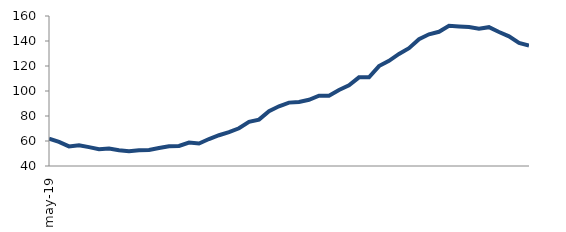
| Category | Series 0 |
|---|---|
| 2019-05-01 | 61.943 |
| 2019-06-01 | 59.307 |
| 2019-07-01 | 55.7 |
| 2019-08-01 | 56.658 |
| 2019-09-01 | 55.107 |
| 2019-10-01 | 53.41 |
| 2019-11-01 | 53.924 |
| 2019-12-01 | 52.607 |
| 2020-01-01 | 51.869 |
| 2020-02-01 | 52.619 |
| 2020-03-01 | 52.83 |
| 2020-04-01 | 54.43 |
| 2020-05-01 | 55.851 |
| 2020-06-01 | 56.062 |
| 2020-07-01 | 58.766 |
| 2020-08-01 | 57.967 |
| 2020-09-01 | 61.563 |
| 2020-10-01 | 64.611 |
| 2020-11-01 | 67.053 |
| 2020-12-01 | 70.207 |
| 2021-01-01 | 75.283 |
| 2021-02-01 | 77.125 |
| 2021-03-01 | 83.917 |
| 2021-04-01 | 87.772 |
| 2021-05-01 | 90.698 |
| 2021-06-01 | 91.254 |
| 2021-07-01 | 92.957 |
| 2021-08-01 | 96.281 |
| 2021-09-01 | 96.228 |
| 2021-10-01 | 100.807 |
| 2021-11-01 | 104.506 |
| 2021-12-01 | 110.93 |
| 2022-01-01 | 110.966 |
| 2022-02-01 | 119.928 |
| 2022-03-01 | 124.133 |
| 2022-04-01 | 129.687 |
| 2022-05-01 | 134.267 |
| 2022-06-01 | 141.471 |
| 2022-07-01 | 145.357 |
| 2022-08-01 | 147.378 |
| 2022-09-01 | 152.132 |
| 2022-10-01 | 151.659 |
| 2022-11-01 | 151.229 |
| 2022-12-01 | 149.84 |
| 2023-01-01 | 151.047 |
| 2023-02-01 | 147.233 |
| 2023-03-01 | 143.736 |
| 2023-04-01 | 138.403 |
| 2023-05-01 | 136.434 |